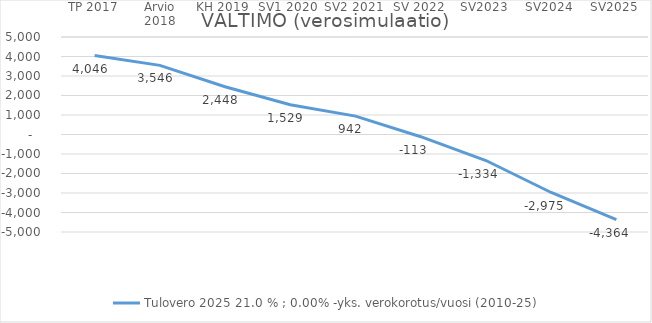
| Category | Tulovero 2025 |
|---|---|
| TP 2017 | 4046 |
| Arvio 2018 | 3546 |
| KH 2019 | 2447.891 |
| SV1 2020 | 1529.358 |
| SV2 2021 | 941.984 |
| SV 2022 | -112.583 |
| SV2023 | -1333.779 |
| SV2024 | -2974.564 |
| SV2025 | -4364.292 |